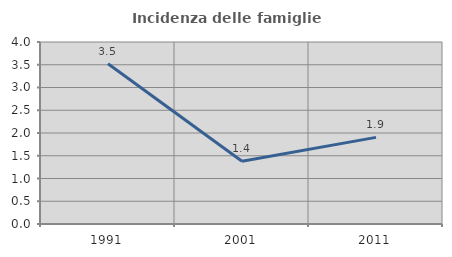
| Category | Incidenza delle famiglie numerose |
|---|---|
| 1991.0 | 3.523 |
| 2001.0 | 1.378 |
| 2011.0 | 1.904 |